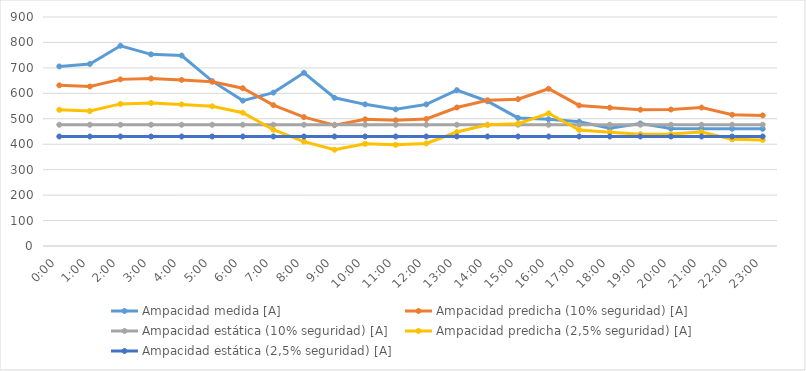
| Category | Ampacidad medida [A] | Ampacidad predicha (10% seguridad) [A] | Ampacidad estática (10% seguridad) [A] | Ampacidad predicha (2,5% seguridad) [A] | Ampacidad estática (2,5% seguridad) [A] |
|---|---|---|---|---|---|
| 0.0 | 705.725 | 631.558 | 476.5 | 535.124 | 430.4 |
| 0.041666666666666664 | 715.452 | 626.823 | 476.5 | 530.389 | 430.4 |
| 0.08333333333333333 | 787.026 | 654.862 | 476.5 | 558.429 | 430.4 |
| 0.125 | 753.232 | 658.309 | 476.5 | 561.875 | 430.4 |
| 0.166666666666667 | 748.493 | 652.821 | 476.5 | 556.387 | 430.4 |
| 0.208333333333333 | 647.901 | 645.513 | 476.5 | 549.079 | 430.4 |
| 0.25 | 571.304 | 620.143 | 476.5 | 523.71 | 430.4 |
| 0.291666666666667 | 602.796 | 553.451 | 476.5 | 457.018 | 430.4 |
| 0.333333333333333 | 680.711 | 506.464 | 476.5 | 410.031 | 430.4 |
| 0.375 | 582.533 | 474.758 | 476.5 | 378.324 | 430.4 |
| 0.416666666666667 | 556.726 | 498.005 | 476.5 | 401.572 | 430.4 |
| 0.458333333333333 | 537.198 | 494.039 | 476.5 | 397.605 | 430.4 |
| 0.5 | 556.402 | 499.371 | 476.5 | 402.937 | 430.4 |
| 0.541666666666667 | 612.531 | 544.307 | 476.5 | 447.873 | 430.4 |
| 0.583333333333333 | 568.908 | 572.576 | 476.5 | 476.142 | 430.4 |
| 0.625 | 503.362 | 577.174 | 476.5 | 480.74 | 430.4 |
| 0.666666666666667 | 497.984 | 617.988 | 476.5 | 521.554 | 430.4 |
| 0.708333333333333 | 488.66 | 552.438 | 476.5 | 456.005 | 430.4 |
| 0.75 | 462.707 | 543.554 | 476.5 | 447.12 | 430.4 |
| 0.791666666666667 | 481.55 | 535.734 | 476.5 | 439.3 | 430.4 |
| 0.833333333333333 | 461.658 | 536.457 | 476.5 | 440.023 | 430.4 |
| 0.875 | 461.141 | 544.078 | 476.5 | 447.644 | 430.4 |
| 0.916666666666667 | 460.757 | 515.81 | 476.5 | 419.376 | 430.4 |
| 0.958333333333333 | 460.473 | 513.282 | 476.5 | 416.848 | 430.4 |